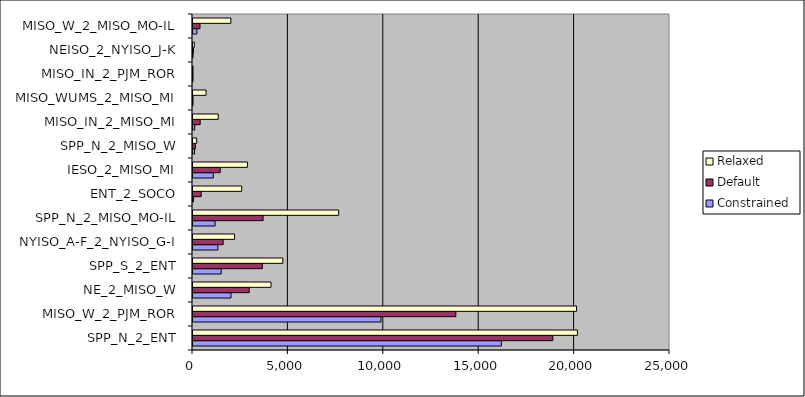
| Category | Constrained | Default | Relaxed |
|---|---|---|---|
| SPP_N_2_ENT | 16163.828 | 18858.715 | 20148.2 |
| MISO_W_2_PJM_ROR | 9852.7 | 13776.387 | 20101.641 |
| NE_2_MISO_W | 1991.432 | 2946.766 | 4086.581 |
| SPP_S_2_ENT | 1476.951 | 3635.672 | 4707.322 |
| NYISO_A-F_2_NYISO_G-I | 1305.288 | 1580.727 | 2179.047 |
| SPP_N_2_MISO_MO-IL | 1158.575 | 3674.373 | 7635.063 |
| ENT_2_SOCO | 19.664 | 428.29 | 2551.108 |
| IESO_2_MISO_MI | 1066.145 | 1426.49 | 2852.37 |
| SPP_N_2_MISO_W | 81.849 | 123.714 | 191.829 |
| MISO_IN_2_MISO_MI | 90.929 | 375.18 | 1321.492 |
| MISO_WUMS_2_MISO_MI | 0.176 | 0.514 | 683.205 |
| MISO_IN_2_PJM_ROR | 0.254 | 0.509 | 1.516 |
| NEISO_2_NYISO_J-K | 2.414 | 26.246 | 67.362 |
| MISO_W_2_MISO_MO-IL | 207.176 | 368.348 | 1984.934 |